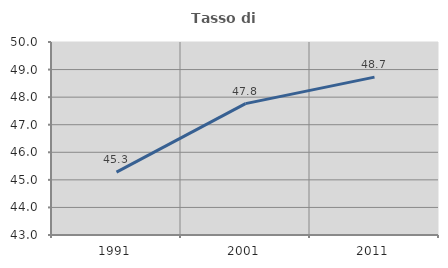
| Category | Tasso di occupazione   |
|---|---|
| 1991.0 | 45.278 |
| 2001.0 | 47.765 |
| 2011.0 | 48.725 |